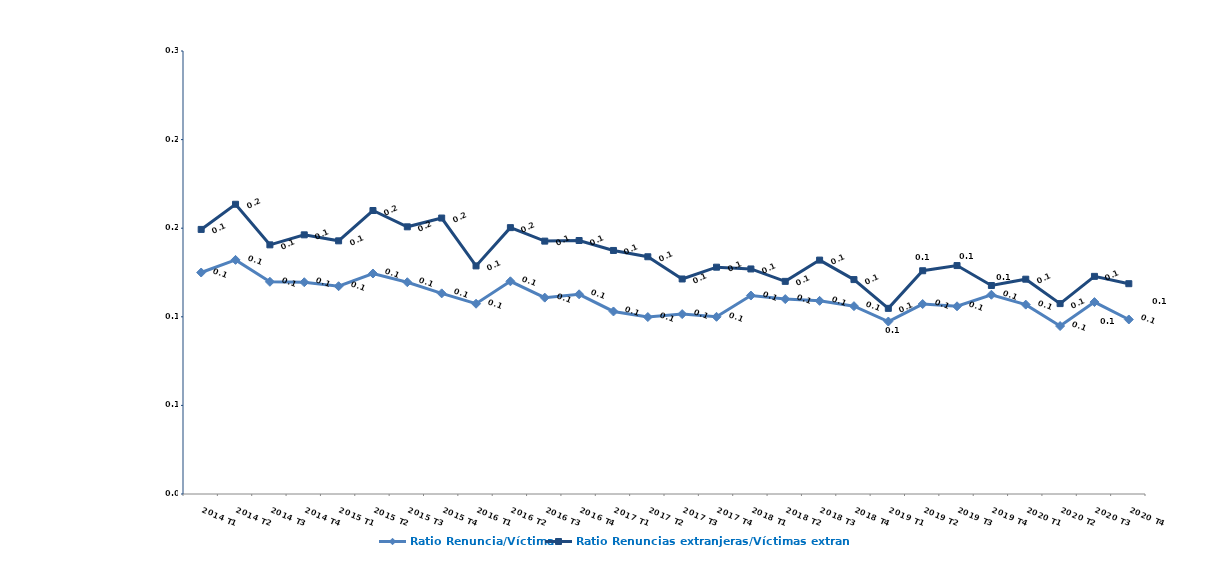
| Category | Ratio Renuncia/Víctima | Ratio Renuncias extranjeras/Víctimas extranjeras |
|---|---|---|
| 2014 T1 | 0.125 | 0.149 |
| 2014 T2 | 0.132 | 0.164 |
| 2014 T3 | 0.12 | 0.141 |
| 2014 T4 | 0.119 | 0.146 |
| 2015 T1 | 0.117 | 0.143 |
| 2015 T2 | 0.124 | 0.16 |
| 2015 T3 | 0.12 | 0.151 |
| 2015 T4 | 0.113 | 0.156 |
| 2016 T1 | 0.107 | 0.129 |
| 2016 T2 | 0.12 | 0.15 |
| 2016 T3 | 0.111 | 0.143 |
| 2016 T4 | 0.113 | 0.143 |
| 2017 T1 | 0.103 | 0.137 |
| 2017 T2 | 0.1 | 0.134 |
| 2017 T3 | 0.102 | 0.121 |
| 2017 T4 | 0.1 | 0.128 |
| 2018 T1 | 0.112 | 0.127 |
| 2018 T2 | 0.11 | 0.12 |
| 2018 T3 | 0.109 | 0.132 |
| 2018 T4 | 0.106 | 0.121 |
| 2019 T1 | 0.097 | 0.105 |
| 2019 T2 | 0.107 | 0.126 |
| 2019 T3 | 0.106 | 0.129 |
| 2019 T4 | 0.112 | 0.118 |
| 2020 T1 | 0.107 | 0.121 |
| 2020 T2 | 0.095 | 0.107 |
| 2020 T3 | 0.108 | 0.123 |
| 2020 T4 | 0.098 | 0.119 |